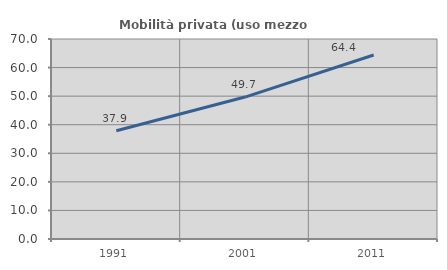
| Category | Mobilità privata (uso mezzo privato) |
|---|---|
| 1991.0 | 37.87 |
| 2001.0 | 49.681 |
| 2011.0 | 64.402 |